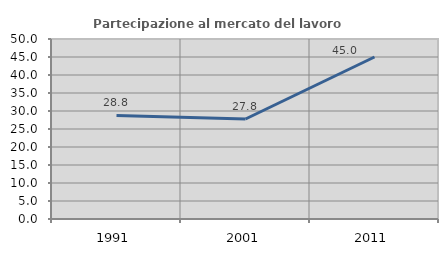
| Category | Partecipazione al mercato del lavoro  femminile |
|---|---|
| 1991.0 | 28.777 |
| 2001.0 | 27.778 |
| 2011.0 | 45 |